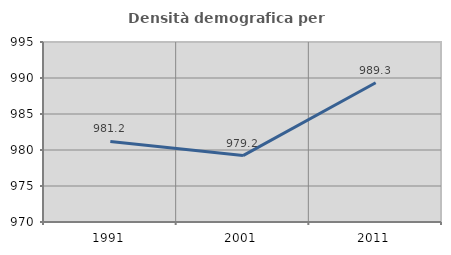
| Category | Densità demografica |
|---|---|
| 1991.0 | 981.186 |
| 2001.0 | 979.226 |
| 2011.0 | 989.337 |